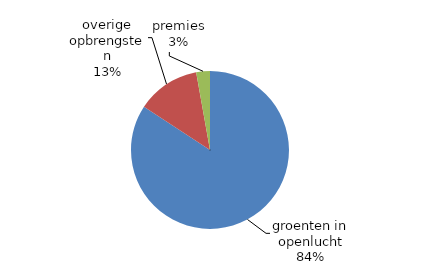
| Category | 2018* |
|---|---|
| groenten in openlucht | 169965.23 |
| overige opbrengsten | 26118.825 |
| premies | 5662.173 |